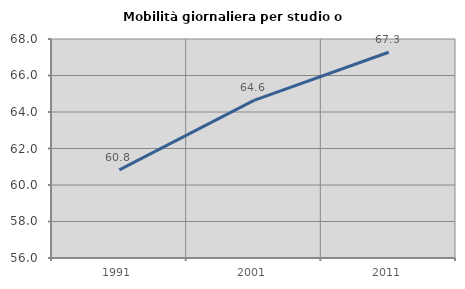
| Category | Mobilità giornaliera per studio o lavoro |
|---|---|
| 1991.0 | 60.829 |
| 2001.0 | 64.64 |
| 2011.0 | 67.272 |